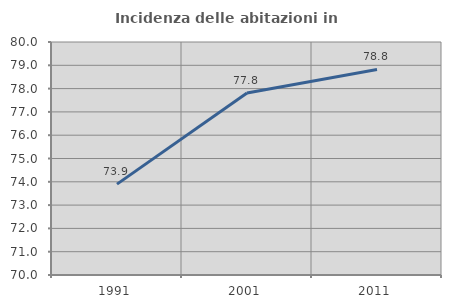
| Category | Incidenza delle abitazioni in proprietà  |
|---|---|
| 1991.0 | 73.901 |
| 2001.0 | 77.813 |
| 2011.0 | 78.824 |